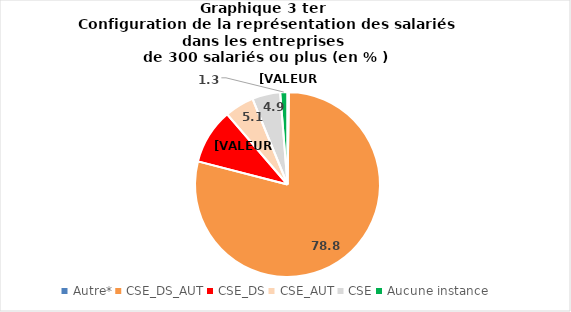
| Category | Series 0 |
|---|---|
| Autre* | 0.25 |
| CSE_DS_AUT | 78.77 |
| CSE_DS | 9.68 |
| CSE_AUT | 5.13 |
| CSE | 4.9 |
| Aucune instance | 1.27 |